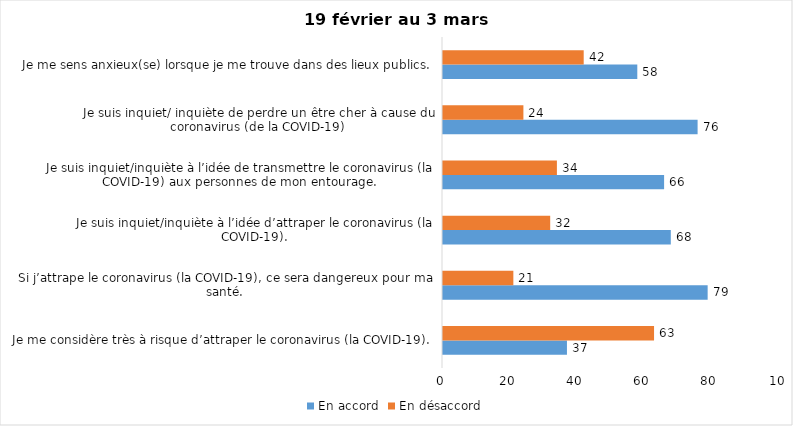
| Category | En accord | En désaccord |
|---|---|---|
| Je me considère très à risque d’attraper le coronavirus (la COVID-19). | 37 | 63 |
| Si j’attrape le coronavirus (la COVID-19), ce sera dangereux pour ma santé. | 79 | 21 |
| Je suis inquiet/inquiète à l’idée d’attraper le coronavirus (la COVID-19). | 68 | 32 |
| Je suis inquiet/inquiète à l’idée de transmettre le coronavirus (la COVID-19) aux personnes de mon entourage. | 66 | 34 |
| Je suis inquiet/ inquiète de perdre un être cher à cause du coronavirus (de la COVID-19) | 76 | 24 |
| Je me sens anxieux(se) lorsque je me trouve dans des lieux publics. | 58 | 42 |